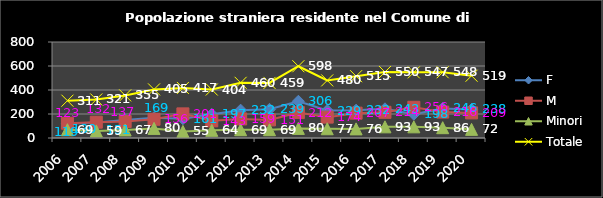
| Category | F | M | Minori | Totale |
|---|---|---|---|---|
| 2006.0 | 119 | 123 | 69 | 311 |
| 2007.0 | 130 | 132 | 59 | 321 |
| 2008.0 | 151 | 137 | 67 | 355 |
| 2009.0 | 169 | 156 | 80 | 405 |
| 2010.0 | 161 | 201 | 55 | 417 |
| 2011.0 | 197 | 143 | 64 | 404 |
| 2012.0 | 232 | 159 | 69 | 460 |
| 2013.0 | 239 | 151 | 69 | 459 |
| 2014.0 | 306 | 212 | 80 | 598 |
| 2015.0 | 229 | 174 | 77 | 480 |
| 2016.0 | 232 | 207 | 76 | 515 |
| 2017.0 | 243 | 214 | 93 | 550 |
| 2018.0 | 198 | 256 | 93 | 547 |
| 2019.0 | 246 | 216 | 86 | 548 |
| 2020.0 | 238 | 209 | 72 | 519 |